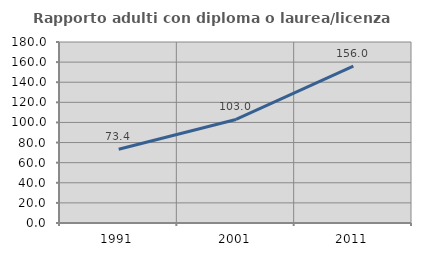
| Category | Rapporto adulti con diploma o laurea/licenza media  |
|---|---|
| 1991.0 | 73.359 |
| 2001.0 | 102.99 |
| 2011.0 | 156.044 |